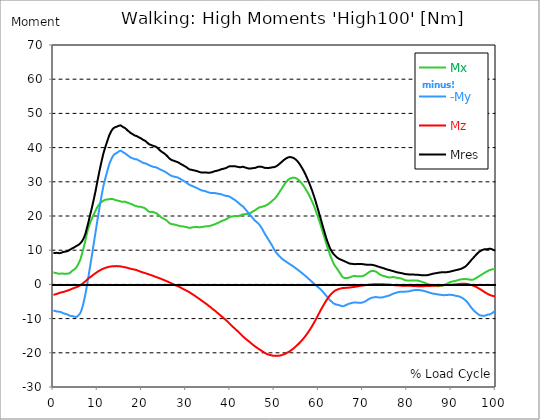
| Category |  Mx |  -My |  Mz |  Mres |
|---|---|---|---|---|
| 0.0 | 3.544 | -7.699 | -3.044 | 9.242 |
| 0.1647276845464841 | 3.461 | -7.671 | -2.988 | 9.159 |
| 0.3294553690929682 | 3.377 | -7.741 | -2.932 | 9.172 |
| 0.5044785339236075 | 3.335 | -7.824 | -2.877 | 9.2 |
| 0.6692062184700917 | 3.294 | -7.894 | -2.821 | 9.228 |
| 0.8339339030165757 | 3.238 | -7.922 | -2.752 | 9.214 |
| 0.9986615875630598 | 3.183 | -7.949 | -2.668 | 9.186 |
| 1.1633892721095438 | 3.113 | -7.991 | -2.613 | 9.172 |
| 1.3384124369401833 | 3.113 | -7.991 | -2.529 | 9.131 |
| 1.5031401214866673 | 3.141 | -8.019 | -2.446 | 9.145 |
| 1.6678678060331513 | 3.141 | -8.075 | -2.376 | 9.172 |
| 1.8325954905796356 | 3.141 | -8.172 | -2.321 | 9.242 |
| 1.9973231751261196 | 3.183 | -8.297 | -2.265 | 9.367 |
| 2.1620508596726036 | 3.155 | -8.408 | -2.238 | 9.45 |
| 2.337074024503243 | 3.141 | -8.491 | -2.182 | 9.52 |
| 2.501801709049727 | 3.127 | -8.533 | -2.112 | 9.548 |
| 2.666529393596211 | 3.127 | -8.575 | -2.043 | 9.575 |
| 2.8312570781426953 | 3.127 | -8.644 | -1.96 | 9.617 |
| 2.9959847626891793 | 3.141 | -8.714 | -1.89 | 9.673 |
| 3.1710079275198186 | 3.183 | -8.769 | -1.807 | 9.728 |
| 3.3357356120663026 | 3.169 | -8.867 | -1.737 | 9.812 |
| 3.500463296612787 | 3.113 | -9.047 | -1.682 | 9.937 |
| 3.665190981159271 | 3.238 | -9.145 | -1.598 | 10.076 |
| 3.8299186657057547 | 3.461 | -9.186 | -1.501 | 10.215 |
| 4.004941830536394 | 3.669 | -9.228 | -1.418 | 10.34 |
| 4.169669515082878 | 3.905 | -9.242 | -1.32 | 10.465 |
| 4.334397199629363 | 4.058 | -9.27 | -1.223 | 10.576 |
| 4.499124884175846 | 4.183 | -9.311 | -1.14 | 10.659 |
| 4.663852568722331 | 4.308 | -9.409 | -1.056 | 10.798 |
| 4.8285802532688145 | 4.461 | -9.464 | -0.987 | 10.924 |
| 5.003603418099454 | 4.656 | -9.52 | -0.917 | 11.062 |
| 5.168331102645938 | 4.864 | -9.534 | -0.834 | 11.188 |
| 5.333058787192422 | 5.225 | -9.436 | -0.75 | 11.313 |
| 5.497786471738906 | 5.629 | -9.284 | -0.653 | 11.424 |
| 5.662514156285391 | 6.073 | -9.075 | -0.542 | 11.549 |
| 5.83753732111603 | 6.518 | -8.853 | -0.431 | 11.73 |
| 6.0022650056625135 | 6.963 | -8.547 | -0.32 | 11.896 |
| 6.166992690208998 | 7.505 | -8.186 | -0.195 | 12.119 |
| 6.331720374755482 | 8.269 | -7.616 | -0.056 | 12.369 |
| 6.496448059301967 | 9.075 | -6.963 | 0.111 | 12.619 |
| 6.671471224132605 | 9.881 | -6.171 | 0.292 | 13.008 |
| 6.836198908679089 | 10.729 | -5.281 | 0.473 | 13.439 |
| 7.000926593225574 | 11.577 | -4.35 | 0.639 | 13.939 |
| 7.165654277772057 | 12.452 | -3.322 | 0.82 | 14.509 |
| 7.330381962318542 | 13.383 | -2.21 | 1.015 | 15.162 |
| 7.495109646865026 | 14.37 | -0.959 | 1.223 | 16.024 |
| 7.670132811695664 | 15.315 | 0.278 | 1.431 | 16.886 |
| 7.8348604962421495 | 16.107 | 1.515 | 1.626 | 17.678 |
| 7.999588180788634 | 16.816 | 2.821 | 1.821 | 18.567 |
| 8.164315865335118 | 17.455 | 4.169 | 1.987 | 19.526 |
| 8.329043549881602 | 18.039 | 5.448 | 2.126 | 20.429 |
| 8.504066714712243 | 18.581 | 6.74 | 2.279 | 21.305 |
| 8.668794399258726 | 19.095 | 8.088 | 2.432 | 22.181 |
| 8.833522083805208 | 19.679 | 9.492 | 2.613 | 23.139 |
| 8.998249768351693 | 20.138 | 10.91 | 2.78 | 24.057 |
| 9.162977452898177 | 20.555 | 12.272 | 2.946 | 25.03 |
| 9.338000617728817 | 21.013 | 13.62 | 3.099 | 26.044 |
| 9.5027283022753 | 21.486 | 14.954 | 3.252 | 27.073 |
| 9.667455986821786 | 21.917 | 16.316 | 3.391 | 28.17 |
| 9.83218367136827 | 22.333 | 17.719 | 3.544 | 29.296 |
| 9.996911355914754 | 22.709 | 19.095 | 3.697 | 30.422 |
| 10.171934520745392 | 23.042 | 20.402 | 3.822 | 31.506 |
| 10.336662205291876 | 23.362 | 21.694 | 3.961 | 32.576 |
| 10.501389889838359 | 23.654 | 23.001 | 4.086 | 33.632 |
| 10.666117574384844 | 23.876 | 24.265 | 4.211 | 34.647 |
| 10.830845258931328 | 24.043 | 25.488 | 4.308 | 35.62 |
| 10.995572943477812 | 24.196 | 26.656 | 4.419 | 36.565 |
| 11.170596108308452 | 24.349 | 27.809 | 4.531 | 37.496 |
| 11.335323792854936 | 24.515 | 28.851 | 4.628 | 38.357 |
| 11.50005147740142 | 24.64 | 29.741 | 4.725 | 39.108 |
| 11.664779161947905 | 24.724 | 30.575 | 4.795 | 39.803 |
| 11.829506846494388 | 24.779 | 31.395 | 4.864 | 40.498 |
| 12.004530011325027 | 24.807 | 32.201 | 4.934 | 41.151 |
| 12.169257695871512 | 24.821 | 33.007 | 4.989 | 41.818 |
| 12.333985380417996 | 24.849 | 33.771 | 5.045 | 42.443 |
| 12.498713064964479 | 24.877 | 34.536 | 5.114 | 43.069 |
| 12.663440749510965 | 24.918 | 35.258 | 5.17 | 43.68 |
| 12.838463914341604 | 24.946 | 35.828 | 5.212 | 44.153 |
| 13.003191598888087 | 24.988 | 36.287 | 5.253 | 44.542 |
| 13.167919283434573 | 24.988 | 36.829 | 5.281 | 44.987 |
| 13.332646967981058 | 25.002 | 37.176 | 5.295 | 45.278 |
| 13.497374652527538 | 24.96 | 37.551 | 5.309 | 45.556 |
| 13.662102337074025 | 24.849 | 37.815 | 5.323 | 45.737 |
| 13.837125501904662 | 24.738 | 38.079 | 5.337 | 45.89 |
| 14.001853186451148 | 24.682 | 38.204 | 5.337 | 45.959 |
| 14.166580870997631 | 24.627 | 38.343 | 5.351 | 46.043 |
| 14.331308555544114 | 24.557 | 38.51 | 5.351 | 46.14 |
| 14.4960362400906 | 24.529 | 38.58 | 5.337 | 46.196 |
| 14.671059404921238 | 24.446 | 38.663 | 5.309 | 46.21 |
| 14.835787089467724 | 24.404 | 38.913 | 5.309 | 46.404 |
| 15.000514774014206 | 24.376 | 39.177 | 5.295 | 46.613 |
| 15.165242458560689 | 24.293 | 39.108 | 5.267 | 46.501 |
| 15.329970143107175 | 24.196 | 39.038 | 5.225 | 46.39 |
| 15.504993307937815 | 24.182 | 38.899 | 5.184 | 46.251 |
| 15.669720992484299 | 24.154 | 38.746 | 5.142 | 46.098 |
| 15.834448677030782 | 24.154 | 38.566 | 5.1 | 45.932 |
| 15.999176361577268 | 24.168 | 38.413 | 5.059 | 45.793 |
| 16.16390404612375 | 24.168 | 38.371 | 5.017 | 45.765 |
| 16.33892721095439 | 24.14 | 38.26 | 4.975 | 45.64 |
| 16.503654895500876 | 24.057 | 38.024 | 4.92 | 45.376 |
| 16.668382580047357 | 23.932 | 37.788 | 4.864 | 45.112 |
| 16.833110264593845 | 23.82 | 37.676 | 4.822 | 44.945 |
| 16.997837949140326 | 23.779 | 37.537 | 4.753 | 44.792 |
| 17.16256563368681 | 23.709 | 37.398 | 4.697 | 44.639 |
| 17.33758879851745 | 23.626 | 37.246 | 4.628 | 44.445 |
| 17.502316483063932 | 23.529 | 37.065 | 4.558 | 44.236 |
| 17.667044167610417 | 23.459 | 36.982 | 4.517 | 44.111 |
| 17.8317718521569 | 23.376 | 36.94 | 4.475 | 44.028 |
| 17.996499536703386 | 23.306 | 36.829 | 4.433 | 43.875 |
| 18.171522701534023 | 23.181 | 36.731 | 4.392 | 43.722 |
| 18.33625038608051 | 23.042 | 36.648 | 4.336 | 43.569 |
| 18.500978070626992 | 22.973 | 36.578 | 4.294 | 43.472 |
| 18.665705755173477 | 22.917 | 36.523 | 4.239 | 43.388 |
| 18.83043343971996 | 22.862 | 36.578 | 4.169 | 43.402 |
| 19.0054566045506 | 22.792 | 36.467 | 4.086 | 43.263 |
| 19.170184289097087 | 22.736 | 36.328 | 4.003 | 43.11 |
| 19.33491197364357 | 22.695 | 36.203 | 3.919 | 42.971 |
| 19.499639658190056 | 22.723 | 36.134 | 3.836 | 42.916 |
| 19.66436734273654 | 22.709 | 36.036 | 3.752 | 42.832 |
| 19.82909502728302 | 22.653 | 35.897 | 3.669 | 42.68 |
| 20.004118192113662 | 22.584 | 35.731 | 3.599 | 42.485 |
| 20.168845876660146 | 22.528 | 35.592 | 3.53 | 42.346 |
| 20.33357356120663 | 22.459 | 35.494 | 3.461 | 42.221 |
| 20.49830124575311 | 22.389 | 35.467 | 3.405 | 42.138 |
| 20.663028930299596 | 22.292 | 35.425 | 3.335 | 42.04 |
| 20.838052095130234 | 22.139 | 35.397 | 3.266 | 41.929 |
| 21.002779779676718 | 21.944 | 35.272 | 3.196 | 41.721 |
| 21.167507464223206 | 21.736 | 35.161 | 3.113 | 41.512 |
| 21.332235148769687 | 21.527 | 35.05 | 3.044 | 41.318 |
| 21.496962833316175 | 21.347 | 34.939 | 2.96 | 41.123 |
| 21.671985998146813 | 21.222 | 34.841 | 2.891 | 40.97 |
| 21.836713682693297 | 21.166 | 34.758 | 2.821 | 40.859 |
| 22.00144136723978 | 21.152 | 34.675 | 2.752 | 40.789 |
| 22.166169051786262 | 21.222 | 34.591 | 2.682 | 40.748 |
| 22.33089673633275 | 21.263 | 34.508 | 2.613 | 40.678 |
| 22.505919901163388 | 21.18 | 34.397 | 2.529 | 40.539 |
| 22.670647585709872 | 21.097 | 34.355 | 2.446 | 40.47 |
| 22.835375270256357 | 21.027 | 34.327 | 2.363 | 40.4 |
| 23.00010295480284 | 20.971 | 34.299 | 2.279 | 40.345 |
| 23.164830639349326 | 20.902 | 34.258 | 2.196 | 40.275 |
| 23.32955832389581 | 20.777 | 34.174 | 2.112 | 40.136 |
| 23.50458148872645 | 20.638 | 34.077 | 2.029 | 39.956 |
| 23.66930917327293 | 20.457 | 33.952 | 1.96 | 39.761 |
| 23.834036857819417 | 20.263 | 33.841 | 1.876 | 39.553 |
| 23.998764542365898 | 20.04 | 33.716 | 1.793 | 39.33 |
| 24.163492226912382 | 19.846 | 33.59 | 1.709 | 39.122 |
| 24.338515391743023 | 19.651 | 33.479 | 1.64 | 38.927 |
| 24.503243076289504 | 19.512 | 33.396 | 1.543 | 38.774 |
| 24.667970760835992 | 19.387 | 33.313 | 1.459 | 38.635 |
| 24.832698445382476 | 19.276 | 33.215 | 1.362 | 38.482 |
| 24.997426129928957 | 19.193 | 33.132 | 1.279 | 38.371 |
| 25.1724492947596 | 19.081 | 33.021 | 1.195 | 38.218 |
| 25.337176979306086 | 18.942 | 32.882 | 1.098 | 38.024 |
| 25.501904663852567 | 18.803 | 32.743 | 1.015 | 37.829 |
| 25.66663234839905 | 18.637 | 32.604 | 0.917 | 37.635 |
| 25.831360032945536 | 18.442 | 32.451 | 0.82 | 37.398 |
| 25.99608771749202 | 18.22 | 32.298 | 0.723 | 37.162 |
| 26.171110882322658 | 17.997 | 32.145 | 0.625 | 36.898 |
| 26.335838566869146 | 17.831 | 31.992 | 0.528 | 36.69 |
| 26.50056625141563 | 17.747 | 31.867 | 0.417 | 36.551 |
| 26.665293935962115 | 17.664 | 31.784 | 0.32 | 36.426 |
| 26.830021620508592 | 17.608 | 31.687 | 0.222 | 36.328 |
| 27.00504478533923 | 17.58 | 31.603 | 0.111 | 36.245 |
| 27.169772469885718 | 17.567 | 31.548 | 0.014 | 36.175 |
| 27.334500154432202 | 17.511 | 31.506 | -0.069 | 36.106 |
| 27.499227838978687 | 17.455 | 31.45 | -0.181 | 36.023 |
| 27.66395552352517 | 17.428 | 31.367 | -0.278 | 35.939 |
| 27.83897868835581 | 17.33 | 31.353 | -0.347 | 35.87 |
| 28.003706372902297 | 17.275 | 31.325 | -0.445 | 35.814 |
| 28.168434057448778 | 17.219 | 31.242 | -0.542 | 35.717 |
| 28.333161741995262 | 17.164 | 31.117 | -0.653 | 35.592 |
| 28.497889426541747 | 17.122 | 30.992 | -0.764 | 35.467 |
| 28.662617111088228 | 17.052 | 30.867 | -0.862 | 35.328 |
| 28.837640275918872 | 16.969 | 30.741 | -0.973 | 35.175 |
| 29.002367960465357 | 16.941 | 30.616 | -1.084 | 35.064 |
| 29.167095645011837 | 16.941 | 30.491 | -1.209 | 34.966 |
| 29.331823329558322 | 16.983 | 30.38 | -1.32 | 34.883 |
| 29.496551014104806 | 16.899 | 30.213 | -1.431 | 34.702 |
| 29.671574178935447 | 16.858 | 30.116 | -1.543 | 34.605 |
| 29.836301863481932 | 16.83 | 29.991 | -1.64 | 34.48 |
| 30.001029548028413 | 16.774 | 29.824 | -1.751 | 34.327 |
| 30.165757232574894 | 16.733 | 29.671 | -1.876 | 34.188 |
| 30.330484917121378 | 16.663 | 29.518 | -1.987 | 34.021 |
| 30.505508081952023 | 16.594 | 29.352 | -2.112 | 33.855 |
| 30.670235766498504 | 16.524 | 29.199 | -2.224 | 33.702 |
| 30.834963451044988 | 16.51 | 29.074 | -2.349 | 33.59 |
| 30.999691135591473 | 16.552 | 28.99 | -2.488 | 33.563 |
| 31.16441882013796 | 16.622 | 28.907 | -2.641 | 33.535 |
| 31.339441984968598 | 16.677 | 28.824 | -2.78 | 33.507 |
| 31.50416966951508 | 16.705 | 28.699 | -2.918 | 33.424 |
| 31.668897354061563 | 16.719 | 28.587 | -3.057 | 33.368 |
| 31.833625038608048 | 16.733 | 28.518 | -3.196 | 33.326 |
| 31.998352723154536 | 16.747 | 28.434 | -3.335 | 33.285 |
| 32.16308040770102 | 16.747 | 28.351 | -3.488 | 33.229 |
| 32.33810357253166 | 16.761 | 28.254 | -3.641 | 33.174 |
| 32.502831257078135 | 16.761 | 28.157 | -3.794 | 33.118 |
| 32.66755894162463 | 16.747 | 28.045 | -3.947 | 33.035 |
| 32.83228662617111 | 16.733 | 27.934 | -4.1 | 32.951 |
| 32.99701431071759 | 16.719 | 27.795 | -4.253 | 32.882 |
| 33.17203747554823 | 16.733 | 27.698 | -4.392 | 32.812 |
| 33.336765160094714 | 16.733 | 27.601 | -4.545 | 32.757 |
| 33.5014928446412 | 16.747 | 27.503 | -4.711 | 32.701 |
| 33.66622052918769 | 16.788 | 27.434 | -4.864 | 32.701 |
| 33.83094821373417 | 16.844 | 27.406 | -5.017 | 32.715 |
| 34.00597137856481 | 16.886 | 27.364 | -5.17 | 32.743 |
| 34.17069906311129 | 16.927 | 27.309 | -5.323 | 32.743 |
| 34.33542674765778 | 16.955 | 27.267 | -5.462 | 32.743 |
| 34.50015443220426 | 16.983 | 27.211 | -5.615 | 32.743 |
| 34.664882116750746 | 16.983 | 27.114 | -5.781 | 32.715 |
| 34.829609801297224 | 16.983 | 27.003 | -5.976 | 32.673 |
| 35.004632966127865 | 17.011 | 26.934 | -6.143 | 32.673 |
| 35.169360650674356 | 17.025 | 26.878 | -6.31 | 32.659 |
| 35.334088335220834 | 17.08 | 26.822 | -6.476 | 32.673 |
| 35.49881601976732 | 17.136 | 26.753 | -6.629 | 32.701 |
| 35.6635437043138 | 17.205 | 26.711 | -6.796 | 32.743 |
| 35.838566869144444 | 17.275 | 26.683 | -6.977 | 32.784 |
| 36.00329455369093 | 17.344 | 26.697 | -7.171 | 32.854 |
| 36.16802223823741 | 17.414 | 26.711 | -7.324 | 32.951 |
| 36.3327499227839 | 17.511 | 26.725 | -7.491 | 33.035 |
| 36.497477607330374 | 17.594 | 26.711 | -7.658 | 33.104 |
| 36.67250077216102 | 17.664 | 26.669 | -7.838 | 33.146 |
| 36.83722845670751 | 17.761 | 26.628 | -8.019 | 33.187 |
| 37.001956141253984 | 17.872 | 26.586 | -8.213 | 33.257 |
| 37.166683825800476 | 17.97 | 26.531 | -8.394 | 33.299 |
| 37.33141151034695 | 18.053 | 26.461 | -8.575 | 33.326 |
| 37.496139194893445 | 18.178 | 26.447 | -8.769 | 33.424 |
| 37.671162359724086 | 18.275 | 26.419 | -8.95 | 33.521 |
| 37.83589004427056 | 18.373 | 26.392 | -9.131 | 33.604 |
| 38.00061772881704 | 18.484 | 26.322 | -9.311 | 33.66 |
| 38.16534541336353 | 18.581 | 26.266 | -9.492 | 33.743 |
| 38.33007309791002 | 18.664 | 26.169 | -9.673 | 33.785 |
| 38.50509626274065 | 18.748 | 26.072 | -9.853 | 33.827 |
| 38.66982394728714 | 18.831 | 26.016 | -10.048 | 33.882 |
| 38.83455163183362 | 18.915 | 25.947 | -10.243 | 33.938 |
| 38.99927931638011 | 19.012 | 25.891 | -10.423 | 34.021 |
| 39.16400700092659 | 19.137 | 25.85 | -10.604 | 34.105 |
| 39.33903016575723 | 19.262 | 25.836 | -10.798 | 34.23 |
| 39.503757850303714 | 19.415 | 25.822 | -11.007 | 34.369 |
| 39.6684855348502 | 19.568 | 25.766 | -11.215 | 34.494 |
| 39.83321321939669 | 19.665 | 25.669 | -11.438 | 34.536 |
| 39.99794090394317 | 19.735 | 25.544 | -11.66 | 34.549 |
| 40.1729640687738 | 19.776 | 25.405 | -11.869 | 34.549 |
| 40.33769175332029 | 19.846 | 25.266 | -12.091 | 34.563 |
| 40.50241943786678 | 19.874 | 25.127 | -12.299 | 34.549 |
| 40.66714712241326 | 19.901 | 24.988 | -12.494 | 34.536 |
| 40.831874806959746 | 19.943 | 24.849 | -12.702 | 34.536 |
| 40.99660249150622 | 19.999 | 24.752 | -12.883 | 34.563 |
| 41.17162565633686 | 19.999 | 24.585 | -13.092 | 34.522 |
| 41.336353340883356 | 19.999 | 24.404 | -13.286 | 34.466 |
| 41.50108102542983 | 19.999 | 24.21 | -13.481 | 34.41 |
| 41.66580870997632 | 19.999 | 24.029 | -13.689 | 34.355 |
| 41.8305363945228 | 20.013 | 23.848 | -13.884 | 34.327 |
| 42.005559559353436 | 20.054 | 23.668 | -14.092 | 34.299 |
| 42.17028724389993 | 20.096 | 23.459 | -14.315 | 34.258 |
| 42.33501492844641 | 20.179 | 23.251 | -14.537 | 34.244 |
| 42.4997426129929 | 20.29 | 23.098 | -14.745 | 34.299 |
| 42.664470297539374 | 20.402 | 22.973 | -14.954 | 34.369 |
| 42.839493462370015 | 20.499 | 22.834 | -15.162 | 34.424 |
| 43.00422114691651 | 20.527 | 22.597 | -15.371 | 34.355 |
| 43.168948831462984 | 20.541 | 22.361 | -15.565 | 34.285 |
| 43.33367651600947 | 20.541 | 22.125 | -15.746 | 34.216 |
| 43.49840420055595 | 20.555 | 21.847 | -15.927 | 34.132 |
| 43.66313188510244 | 20.568 | 21.583 | -16.107 | 34.063 |
| 43.83815504993308 | 20.596 | 21.333 | -16.274 | 33.994 |
| 44.00288273447956 | 20.638 | 21.041 | -16.441 | 33.924 |
| 44.16761041902604 | 20.694 | 20.763 | -16.622 | 33.868 |
| 44.332338103572525 | 20.749 | 20.513 | -16.788 | 33.841 |
| 44.49706578811901 | 20.846 | 20.29 | -16.969 | 33.855 |
| 44.67208895294965 | 20.971 | 20.054 | -17.164 | 33.896 |
| 44.836816637496135 | 21.124 | 19.79 | -17.358 | 33.938 |
| 45.00154432204262 | 21.263 | 19.498 | -17.525 | 33.966 |
| 45.166272006589104 | 21.375 | 19.234 | -17.706 | 33.994 |
| 45.33099969113559 | 21.472 | 18.97 | -17.858 | 33.994 |
| 45.50602285596623 | 21.597 | 18.748 | -18.025 | 34.035 |
| 45.670750540512714 | 21.736 | 18.567 | -18.178 | 34.091 |
| 45.83547822505919 | 21.889 | 18.373 | -18.331 | 34.16 |
| 46.00020590960568 | 22.055 | 18.178 | -18.484 | 34.244 |
| 46.16493359415217 | 22.222 | 18.011 | -18.637 | 34.341 |
| 46.3399567589828 | 22.333 | 17.803 | -18.79 | 34.383 |
| 46.50468444352929 | 22.459 | 17.594 | -18.929 | 34.438 |
| 46.66941212807577 | 22.556 | 17.316 | -19.068 | 34.466 |
| 46.83413981262226 | 22.584 | 16.997 | -19.193 | 34.424 |
| 46.99886749716874 | 22.653 | 16.677 | -19.332 | 34.369 |
| 47.16359518171523 | 22.723 | 16.344 | -19.484 | 34.355 |
| 47.33861834654586 | 22.778 | 15.954 | -19.637 | 34.299 |
| 47.50334603109235 | 22.82 | 15.538 | -19.79 | 34.202 |
| 47.66807371563883 | 22.889 | 15.134 | -19.915 | 34.132 |
| 47.83280140018532 | 22.945 | 14.745 | -20.04 | 34.063 |
| 47.997529084731795 | 23.042 | 14.398 | -20.152 | 34.049 |
| 48.172552249562436 | 23.167 | 14.092 | -20.263 | 34.077 |
| 48.33727993410892 | 23.292 | 13.717 | -20.388 | 34.049 |
| 48.502007618655405 | 23.362 | 13.369 | -20.443 | 34.021 |
| 48.6667353032019 | 23.529 | 13.008 | -20.513 | 34.049 |
| 48.831462987748374 | 23.709 | 12.675 | -20.568 | 34.077 |
| 49.00648615257901 | 23.89 | 12.341 | -20.638 | 34.119 |
| 49.17121383712551 | 24.043 | 11.98 | -20.68 | 34.132 |
| 49.335941521671984 | 24.265 | 11.646 | -20.749 | 34.188 |
| 49.50066920621847 | 24.474 | 11.243 | -20.805 | 34.258 |
| 49.66539689076495 | 24.64 | 10.84 | -20.846 | 34.271 |
| 49.83012457531144 | 24.779 | 10.437 | -20.86 | 34.271 |
| 50.00514774014208 | 24.988 | 10.062 | -20.874 | 34.313 |
| 50.16987542468856 | 25.21 | 9.714 | -20.888 | 34.383 |
| 50.33460310923505 | 25.488 | 9.395 | -20.902 | 34.48 |
| 50.499330793781525 | 25.78 | 9.117 | -20.902 | 34.605 |
| 50.66405847832801 | 26.072 | 8.867 | -20.888 | 34.772 |
| 50.83908164315865 | 26.392 | 8.63 | -20.874 | 34.925 |
| 51.003809327705135 | 26.725 | 8.408 | -20.86 | 35.105 |
| 51.16853701225162 | 27.086 | 8.186 | -20.819 | 35.3 |
| 51.3332646967981 | 27.42 | 7.963 | -20.777 | 35.494 |
| 51.49799238134458 | 27.726 | 7.713 | -20.721 | 35.647 |
| 51.67301554617522 | 28.059 | 7.532 | -20.652 | 35.842 |
| 51.837743230721706 | 28.448 | 7.38 | -20.568 | 36.064 |
| 52.00247091526819 | 28.754 | 7.199 | -20.485 | 36.217 |
| 52.16719859981468 | 29.102 | 7.046 | -20.416 | 36.426 |
| 52.33192628436116 | 29.407 | 6.907 | -20.332 | 36.592 |
| 52.5069494491918 | 29.685 | 6.754 | -20.221 | 36.731 |
| 52.67167713373829 | 29.963 | 6.601 | -20.11 | 36.87 |
| 52.83640481828477 | 30.213 | 6.448 | -20.013 | 36.982 |
| 53.00113250283126 | 30.45 | 6.323 | -19.887 | 37.093 |
| 53.16586018737774 | 30.658 | 6.157 | -19.776 | 37.162 |
| 53.33058787192423 | 30.811 | 6.018 | -19.651 | 37.204 |
| 53.50561103675487 | 30.978 | 5.906 | -19.512 | 37.246 |
| 53.67033872130134 | 31.047 | 5.768 | -19.345 | 37.204 |
| 53.83506640584783 | 31.117 | 5.629 | -19.193 | 37.162 |
| 53.99979409039431 | 31.158 | 5.476 | -19.026 | 37.093 |
| 54.164521774940795 | 31.214 | 5.337 | -18.859 | 37.037 |
| 54.339544939771436 | 31.228 | 5.184 | -18.678 | 36.94 |
| 54.50427262431792 | 31.2 | 5.017 | -18.498 | 36.815 |
| 54.669000308864405 | 31.145 | 4.85 | -18.317 | 36.648 |
| 54.83372799341089 | 31.061 | 4.683 | -18.122 | 36.467 |
| 54.998455677957374 | 30.978 | 4.531 | -17.928 | 36.287 |
| 55.173478842788015 | 30.839 | 4.378 | -17.719 | 36.064 |
| 55.3382065273345 | 30.658 | 4.211 | -17.511 | 35.786 |
| 55.502934211880984 | 30.477 | 4.03 | -17.303 | 35.508 |
| 55.66766189642746 | 30.269 | 3.864 | -17.08 | 35.217 |
| 55.83238958097395 | 30.033 | 3.697 | -16.858 | 34.883 |
| 55.997117265520444 | 29.783 | 3.53 | -16.622 | 34.536 |
| 56.17214043035107 | 29.518 | 3.363 | -16.385 | 34.188 |
| 56.336868114897555 | 29.241 | 3.183 | -16.149 | 33.813 |
| 56.50159579944404 | 28.935 | 3.002 | -15.899 | 33.424 |
| 56.666323483990524 | 28.615 | 2.821 | -15.635 | 33.007 |
| 56.83105116853701 | 28.296 | 2.641 | -15.371 | 32.59 |
| 57.00607433336764 | 27.976 | 2.46 | -15.093 | 32.159 |
| 57.170802017914134 | 27.601 | 2.293 | -14.801 | 31.673 |
| 57.33552970246061 | 27.239 | 2.099 | -14.495 | 31.2 |
| 57.5002573870071 | 26.85 | 1.89 | -14.203 | 30.714 |
| 57.66498507155359 | 26.461 | 1.696 | -13.884 | 30.213 |
| 57.84000823638422 | 26.044 | 1.515 | -13.564 | 29.685 |
| 58.00473592093071 | 25.613 | 1.32 | -13.231 | 29.143 |
| 58.16946360547718 | 25.169 | 1.126 | -12.897 | 28.587 |
| 58.334191290023675 | 24.71 | 0.917 | -12.55 | 28.018 |
| 58.49891897457017 | 24.237 | 0.723 | -12.188 | 27.434 |
| 58.663646659116644 | 23.737 | 0.528 | -11.827 | 26.822 |
| 58.838669823947285 | 23.237 | 0.334 | -11.438 | 26.183 |
| 59.00339750849377 | 22.681 | 0.139 | -11.049 | 25.53 |
| 59.168125193040254 | 22.111 | -0.056 | -10.659 | 24.835 |
| 59.33285287758674 | 21.513 | -0.236 | -10.27 | 24.126 |
| 59.49758056213322 | 20.888 | -0.417 | -9.867 | 23.39 |
| 59.672603726963864 | 20.29 | -0.598 | -9.464 | 22.681 |
| 59.83733141151035 | 19.665 | -0.778 | -9.047 | 21.93 |
| 60.002059096056826 | 19.026 | -0.973 | -8.63 | 21.18 |
| 60.16678678060332 | 18.414 | -1.167 | -8.213 | 20.457 |
| 60.33151446514979 | 17.761 | -1.348 | -7.797 | 19.707 |
| 60.506537629980436 | 17.08 | -1.557 | -7.394 | 18.942 |
| 60.67126531452693 | 16.344 | -1.779 | -7.004 | 18.15 |
| 60.8359929990734 | 15.649 | -2.015 | -6.629 | 17.4 |
| 61.00072068361989 | 14.94 | -2.265 | -6.254 | 16.635 |
| 61.165448368166366 | 14.231 | -2.515 | -5.879 | 15.899 |
| 61.34047153299701 | 13.522 | -2.766 | -5.517 | 15.162 |
| 61.5051992175435 | 12.814 | -3.002 | -5.17 | 14.44 |
| 61.669926902089976 | 12.091 | -3.266 | -4.809 | 13.703 |
| 61.83465458663647 | 11.396 | -3.544 | -4.461 | 13.022 |
| 61.999382271182945 | 10.743 | -3.808 | -4.128 | 12.411 |
| 62.16410995572944 | 10.117 | -4.044 | -3.836 | 11.855 |
| 62.33913312056008 | 9.492 | -4.308 | -3.544 | 11.299 |
| 62.50386080510655 | 8.853 | -4.545 | -3.266 | 10.757 |
| 62.66858848965305 | 8.269 | -4.781 | -3.002 | 10.256 |
| 62.83331617419952 | 7.769 | -4.934 | -2.807 | 9.909 |
| 62.998043858746 | 7.227 | -5.128 | -2.585 | 9.548 |
| 63.17306702357666 | 6.671 | -5.351 | -2.376 | 9.214 |
| 63.33779470812313 | 6.171 | -5.559 | -2.168 | 8.922 |
| 63.50252239266961 | 5.768 | -5.698 | -1.987 | 8.658 |
| 63.667250077216096 | 5.462 | -5.768 | -1.848 | 8.464 |
| 63.83197776176258 | 5.128 | -5.879 | -1.709 | 8.241 |
| 64.00700092659322 | 4.85 | -5.906 | -1.612 | 8.061 |
| 64.1717286111397 | 4.558 | -5.934 | -1.529 | 7.852 |
| 64.33645629568619 | 4.197 | -5.99 | -1.445 | 7.671 |
| 64.50118398023267 | 3.864 | -6.045 | -1.376 | 7.546 |
| 64.66591166477916 | 3.572 | -6.087 | -1.306 | 7.435 |
| 64.83063934932565 | 3.238 | -6.157 | -1.237 | 7.338 |
| 65.00566251415627 | 2.918 | -6.24 | -1.181 | 7.255 |
| 65.17039019870276 | 2.557 | -6.323 | -1.126 | 7.143 |
| 65.33511788324925 | 2.224 | -6.393 | -1.084 | 7.032 |
| 65.49984556779573 | 2.029 | -6.379 | -1.056 | 6.963 |
| 65.66457325234222 | 1.918 | -6.337 | -1.028 | 6.879 |
| 65.83959641717286 | 1.876 | -6.24 | -1.028 | 6.768 |
| 66.00432410171935 | 1.848 | -6.143 | -1.015 | 6.671 |
| 66.16905178626584 | 1.834 | -6.045 | -1.015 | 6.574 |
| 66.3337794708123 | 1.848 | -5.948 | -1.001 | 6.462 |
| 66.4985071553588 | 1.904 | -5.837 | -0.987 | 6.351 |
| 66.67353032018943 | 1.96 | -5.74 | -0.959 | 6.254 |
| 66.83825800473592 | 2.001 | -5.656 | -0.931 | 6.171 |
| 67.0029856892824 | 2.029 | -5.601 | -0.903 | 6.115 |
| 67.16771337382887 | 2.071 | -5.545 | -0.876 | 6.059 |
| 67.33244105837538 | 2.224 | -5.476 | -0.862 | 6.032 |
| 67.49716874292186 | 2.307 | -5.42 | -0.82 | 6.018 |
| 67.67219190775249 | 2.376 | -5.364 | -0.792 | 5.99 |
| 67.83691959229898 | 2.432 | -5.323 | -0.764 | 5.962 |
| 68.00164727684546 | 2.46 | -5.281 | -0.737 | 5.934 |
| 68.16637496139195 | 2.46 | -5.267 | -0.695 | 5.92 |
| 68.33110264593842 | 2.432 | -5.281 | -0.667 | 5.92 |
| 68.50612581076906 | 2.404 | -5.309 | -0.639 | 5.934 |
| 68.67085349531555 | 2.39 | -5.323 | -0.598 | 5.934 |
| 68.83558117986203 | 2.363 | -5.337 | -0.57 | 5.934 |
| 69.00030886440852 | 2.335 | -5.364 | -0.528 | 5.948 |
| 69.165036548955 | 2.335 | -5.364 | -0.486 | 5.948 |
| 69.34005971378564 | 2.376 | -5.351 | -0.445 | 5.948 |
| 69.50478739833213 | 2.363 | -5.351 | -0.417 | 5.962 |
| 69.66951508287862 | 2.363 | -5.351 | -0.375 | 5.962 |
| 69.8342427674251 | 2.39 | -5.309 | -0.347 | 5.934 |
| 69.99897045197157 | 2.46 | -5.253 | -0.32 | 5.906 |
| 70.17399361680222 | 2.557 | -5.17 | -0.292 | 5.879 |
| 70.33872130134871 | 2.654 | -5.073 | -0.264 | 5.851 |
| 70.50344898589518 | 2.78 | -4.975 | -0.236 | 5.809 |
| 70.66817667044167 | 2.932 | -4.864 | -0.208 | 5.795 |
| 70.83290435498816 | 3.071 | -4.725 | -0.181 | 5.768 |
| 70.99763203953464 | 3.238 | -4.558 | -0.167 | 5.768 |
| 71.17265520436527 | 3.391 | -4.419 | -0.139 | 5.754 |
| 71.33738288891176 | 3.544 | -4.294 | -0.111 | 5.754 |
| 71.50211057345825 | 3.683 | -4.183 | -0.083 | 5.768 |
| 71.66683825800473 | 3.822 | -4.072 | -0.056 | 5.768 |
| 71.83156594255121 | 3.891 | -4.003 | -0.028 | 5.768 |
| 72.00658910738186 | 3.933 | -3.919 | -0.014 | 5.726 |
| 72.17131679192833 | 3.933 | -3.85 | 0.014 | 5.684 |
| 72.33604447647483 | 3.919 | -3.808 | 0.014 | 5.642 |
| 72.5007721610213 | 3.891 | -3.766 | 0.028 | 5.587 |
| 72.6654998455678 | 3.85 | -3.725 | 0.042 | 5.531 |
| 72.84052301039843 | 3.794 | -3.711 | 0.056 | 5.476 |
| 73.0052506949449 | 3.697 | -3.711 | 0.056 | 5.406 |
| 73.1699783794914 | 3.558 | -3.725 | 0.056 | 5.323 |
| 73.33470606403789 | 3.391 | -3.766 | 0.056 | 5.253 |
| 73.49943374858437 | 3.183 | -3.808 | 0.069 | 5.184 |
| 73.66416143313084 | 3.03 | -3.836 | 0.069 | 5.114 |
| 73.83918459796149 | 2.891 | -3.85 | 0.069 | 5.045 |
| 74.00391228250797 | 2.78 | -3.85 | 0.056 | 4.989 |
| 74.16863996705446 | 2.696 | -3.836 | 0.056 | 4.92 |
| 74.33336765160095 | 2.585 | -3.808 | 0.042 | 4.836 |
| 74.49809533614743 | 2.529 | -3.752 | 0.028 | 4.781 |
| 74.67311850097806 | 2.474 | -3.697 | 0.028 | 4.725 |
| 74.83784618552455 | 2.432 | -3.627 | 0.014 | 4.67 |
| 75.00257387007105 | 2.363 | -3.586 | 0 | 4.572 |
| 75.16730155461751 | 2.265 | -3.53 | -0.014 | 4.489 |
| 75.332029239164 | 2.196 | -3.474 | -0.028 | 4.406 |
| 75.50705240399465 | 2.14 | -3.419 | -0.028 | 4.336 |
| 75.67178008854113 | 2.099 | -3.349 | -0.056 | 4.28 |
| 75.8365077730876 | 2.043 | -3.294 | -0.069 | 4.239 |
| 76.00123545763408 | 2.001 | -3.238 | -0.083 | 4.183 |
| 76.16596314218059 | 2.015 | -3.141 | -0.111 | 4.128 |
| 76.34098630701122 | 2.071 | -3.016 | -0.125 | 4.058 |
| 76.5057139915577 | 2.112 | -2.905 | -0.139 | 3.989 |
| 76.67044167610419 | 2.14 | -2.807 | -0.167 | 3.933 |
| 76.83516936065067 | 2.14 | -2.724 | -0.181 | 3.877 |
| 76.99989704519716 | 2.126 | -2.641 | -0.208 | 3.822 |
| 77.16462472974364 | 2.085 | -2.585 | -0.222 | 3.752 |
| 77.33964789457428 | 2.029 | -2.515 | -0.236 | 3.683 |
| 77.50437557912076 | 1.96 | -2.446 | -0.264 | 3.599 |
| 77.66910326366724 | 1.932 | -2.376 | -0.278 | 3.544 |
| 77.83383094821373 | 1.904 | -2.307 | -0.292 | 3.502 |
| 77.99855863276022 | 1.89 | -2.251 | -0.306 | 3.461 |
| 78.17358179759084 | 1.862 | -2.196 | -0.32 | 3.419 |
| 78.33830948213735 | 1.821 | -2.154 | -0.334 | 3.377 |
| 78.50303716668382 | 1.793 | -2.126 | -0.347 | 3.349 |
| 78.6677648512303 | 1.709 | -2.112 | -0.361 | 3.308 |
| 78.8324925357768 | 1.612 | -2.126 | -0.361 | 3.266 |
| 79.00751570060743 | 1.515 | -2.126 | -0.375 | 3.21 |
| 79.17224338515392 | 1.418 | -2.14 | -0.375 | 3.141 |
| 79.3369710697004 | 1.32 | -2.14 | -0.375 | 3.085 |
| 79.50169875424687 | 1.237 | -2.126 | -0.375 | 3.03 |
| 79.66642643879338 | 1.181 | -2.112 | -0.389 | 2.988 |
| 79.83115412333984 | 1.154 | -2.071 | -0.389 | 2.974 |
| 80.00617728817049 | 1.14 | -2.071 | -0.389 | 2.974 |
| 80.17090497271697 | 1.112 | -2.057 | -0.403 | 2.946 |
| 80.33563265726346 | 1.098 | -2.029 | -0.403 | 2.918 |
| 80.50036034180994 | 1.084 | -1.973 | -0.417 | 2.891 |
| 80.66508802635641 | 1.112 | -1.932 | -0.417 | 2.891 |
| 80.84011119118706 | 1.154 | -1.848 | -0.431 | 2.905 |
| 81.00483887573355 | 1.167 | -1.793 | -0.431 | 2.918 |
| 81.16956656028003 | 1.14 | -1.779 | -0.445 | 2.891 |
| 81.33429424482652 | 1.126 | -1.751 | -0.459 | 2.877 |
| 81.499021929373 | 1.126 | -1.709 | -0.473 | 2.863 |
| 81.67404509420363 | 1.14 | -1.682 | -0.486 | 2.863 |
| 81.83877277875014 | 1.14 | -1.654 | -0.486 | 2.849 |
| 82.00350046329662 | 1.126 | -1.64 | -0.5 | 2.835 |
| 82.1682281478431 | 1.112 | -1.64 | -0.5 | 2.821 |
| 82.33295583238957 | 1.112 | -1.626 | -0.514 | 2.807 |
| 82.50797899722022 | 1.07 | -1.64 | -0.514 | 2.793 |
| 82.67270668176671 | 1.028 | -1.668 | -0.514 | 2.766 |
| 82.83743436631318 | 0.973 | -1.696 | -0.514 | 2.752 |
| 83.00216205085967 | 0.903 | -1.723 | -0.514 | 2.724 |
| 83.16688973540616 | 0.834 | -1.751 | -0.514 | 2.696 |
| 83.33161741995264 | 0.75 | -1.779 | -0.514 | 2.682 |
| 83.50664058478327 | 0.681 | -1.821 | -0.514 | 2.668 |
| 83.67136826932976 | 0.611 | -1.862 | -0.514 | 2.654 |
| 83.83609595387625 | 0.528 | -1.918 | -0.5 | 2.654 |
| 84.00082363842272 | 0.459 | -1.987 | -0.5 | 2.682 |
| 84.16555132296921 | 0.361 | -2.057 | -0.5 | 2.682 |
| 84.34057448779986 | 0.264 | -2.112 | -0.486 | 2.682 |
| 84.50530217234633 | 0.181 | -2.182 | -0.486 | 2.696 |
| 84.67002985689282 | 0.111 | -2.238 | -0.473 | 2.724 |
| 84.83475754143929 | 0.028 | -2.307 | -0.459 | 2.78 |
| 84.9994852259858 | -0.069 | -2.39 | -0.459 | 2.835 |
| 85.17450839081643 | -0.195 | -2.46 | -0.445 | 2.891 |
| 85.3392360753629 | -0.264 | -2.529 | -0.431 | 2.946 |
| 85.5039637599094 | -0.32 | -2.585 | -0.417 | 3.016 |
| 85.66869144445587 | -0.347 | -2.641 | -0.403 | 3.071 |
| 85.83341912900237 | -0.361 | -2.696 | -0.403 | 3.127 |
| 85.99814681354884 | -0.375 | -2.724 | -0.389 | 3.169 |
| 86.17316997837949 | -0.389 | -2.766 | -0.375 | 3.21 |
| 86.33789766292597 | -0.417 | -2.807 | -0.361 | 3.238 |
| 86.50262534747245 | -0.445 | -2.821 | -0.347 | 3.266 |
| 86.66735303201894 | -0.486 | -2.863 | -0.334 | 3.308 |
| 86.83208071656543 | -0.514 | -2.905 | -0.32 | 3.363 |
| 87.00710388139605 | -0.528 | -2.946 | -0.32 | 3.405 |
| 87.17183156594255 | -0.514 | -2.974 | -0.306 | 3.433 |
| 87.33655925048905 | -0.486 | -3.002 | -0.292 | 3.474 |
| 87.50128693503551 | -0.459 | -3.03 | -0.264 | 3.502 |
| 87.666014619582 | -0.417 | -3.057 | -0.25 | 3.53 |
| 87.84103778441263 | -0.375 | -3.099 | -0.25 | 3.544 |
| 88.00576546895913 | -0.334 | -3.113 | -0.236 | 3.558 |
| 88.1704931535056 | -0.292 | -3.127 | -0.222 | 3.572 |
| 88.33522083805208 | -0.208 | -3.155 | -0.208 | 3.558 |
| 88.49994852259859 | -0.111 | -3.141 | -0.195 | 3.544 |
| 88.66467620714505 | -0.014 | -3.127 | -0.195 | 3.544 |
| 88.8396993719757 | 0.097 | -3.113 | -0.181 | 3.544 |
| 89.00442705652219 | 0.195 | -3.085 | -0.167 | 3.572 |
| 89.16915474106867 | 0.306 | -3.071 | -0.167 | 3.613 |
| 89.33388242561514 | 0.431 | -3.057 | -0.153 | 3.669 |
| 89.49861011016162 | 0.556 | -3.044 | -0.139 | 3.697 |
| 89.67363327499227 | 0.667 | -3.016 | -0.125 | 3.738 |
| 89.83836095953876 | 0.737 | -3.03 | -0.111 | 3.78 |
| 90.00308864408524 | 0.778 | -3.071 | -0.111 | 3.836 |
| 90.16781632863173 | 0.82 | -3.099 | -0.097 | 3.905 |
| 90.33254401317821 | 0.876 | -3.127 | -0.083 | 3.947 |
| 90.50756717800884 | 0.917 | -3.169 | -0.056 | 4.003 |
| 90.67229486255535 | 0.959 | -3.224 | -0.042 | 4.072 |
| 90.83702254710182 | 1.001 | -3.28 | -0.014 | 4.114 |
| 91.0017502316483 | 1.056 | -3.322 | 0.014 | 4.155 |
| 91.16647791619478 | 1.126 | -3.363 | 0.042 | 4.211 |
| 91.34150108102543 | 1.195 | -3.405 | 0.056 | 4.267 |
| 91.50622876557192 | 1.292 | -3.447 | 0.097 | 4.322 |
| 91.67095645011838 | 1.334 | -3.502 | 0.125 | 4.378 |
| 91.83568413466487 | 1.376 | -3.572 | 0.139 | 4.433 |
| 92.00041181921137 | 1.431 | -3.641 | 0.153 | 4.489 |
| 92.16513950375784 | 1.418 | -3.752 | 0.167 | 4.531 |
| 92.34016266858848 | 1.487 | -3.877 | 0.181 | 4.642 |
| 92.50489035313497 | 1.543 | -4.016 | 0.195 | 4.739 |
| 92.66961803768146 | 1.57 | -4.141 | 0.208 | 4.85 |
| 92.83434572222792 | 1.57 | -4.294 | 0.222 | 4.961 |
| 92.99907340677441 | 1.543 | -4.461 | 0.208 | 5.073 |
| 93.17409657160506 | 1.529 | -4.642 | 0.195 | 5.225 |
| 93.33882425615154 | 1.543 | -4.822 | 0.167 | 5.42 |
| 93.50355194069803 | 1.543 | -5.045 | 0.139 | 5.629 |
| 93.66827962524452 | 1.515 | -5.323 | 0.097 | 5.851 |
| 93.833007309791 | 1.487 | -5.601 | 0.042 | 6.101 |
| 94.00803047462163 | 1.445 | -5.893 | -0.014 | 6.337 |
| 94.17275815916813 | 1.39 | -6.184 | -0.056 | 6.587 |
| 94.3374858437146 | 1.348 | -6.504 | -0.097 | 6.865 |
| 94.5022135282611 | 1.334 | -6.782 | -0.167 | 7.129 |
| 94.66694121280757 | 1.362 | -7.046 | -0.236 | 7.38 |
| 94.83166889735405 | 1.376 | -7.296 | -0.32 | 7.588 |
| 95.0066920621847 | 1.418 | -7.546 | -0.403 | 7.81 |
| 95.17141974673117 | 1.529 | -7.769 | -0.473 | 8.061 |
| 95.33614743127767 | 1.682 | -7.963 | -0.57 | 8.297 |
| 95.50087511582414 | 1.779 | -8.186 | -0.667 | 8.547 |
| 95.66560280037064 | 1.918 | -8.339 | -0.778 | 8.755 |
| 95.84062596520126 | 2.071 | -8.505 | -0.889 | 8.978 |
| 96.00535364974776 | 2.182 | -8.686 | -1.028 | 9.2 |
| 96.17008133429425 | 2.307 | -8.853 | -1.154 | 9.409 |
| 96.33480901884072 | 2.46 | -8.964 | -1.279 | 9.575 |
| 96.49953670338721 | 2.585 | -9.047 | -1.39 | 9.714 |
| 96.67455986821784 | 2.71 | -9.103 | -1.529 | 9.839 |
| 96.83928755276433 | 2.863 | -9.145 | -1.668 | 9.951 |
| 97.00401523731081 | 2.988 | -9.159 | -1.821 | 10.048 |
| 97.1687429218573 | 3.113 | -9.186 | -1.973 | 10.145 |
| 97.3334706064038 | 3.252 | -9.172 | -2.112 | 10.215 |
| 97.49819829095026 | 3.391 | -9.145 | -2.251 | 10.27 |
| 97.67322145578092 | 3.516 | -9.117 | -2.39 | 10.312 |
| 97.8379491403274 | 3.655 | -9.02 | -2.502 | 10.298 |
| 98.00267682487387 | 3.78 | -8.922 | -2.613 | 10.284 |
| 98.16740450942035 | 3.905 | -8.839 | -2.738 | 10.298 |
| 98.33213219396683 | 4.003 | -8.811 | -2.877 | 10.34 |
| 98.50715535879748 | 4.1 | -8.797 | -2.988 | 10.409 |
| 98.67188304334397 | 4.197 | -8.769 | -3.071 | 10.437 |
| 98.83661072789045 | 4.267 | -8.672 | -3.155 | 10.409 |
| 99.00133841243694 | 4.322 | -8.561 | -3.252 | 10.368 |
| 99.16606609698341 | 4.378 | -8.436 | -3.308 | 10.298 |
| 99.34108926181405 | 4.433 | -8.283 | -3.363 | 10.201 |
| 99.50581694636055 | 4.461 | -8.13 | -3.419 | 10.09 |
| 99.67054463090703 | 4.461 | -7.977 | -3.474 | 9.978 |
| 99.83527231545351 | 4.461 | -7.824 | -3.53 | 9.867 |
| 100.0 | 4.475 | -7.699 | -3.586 | 9.784 |